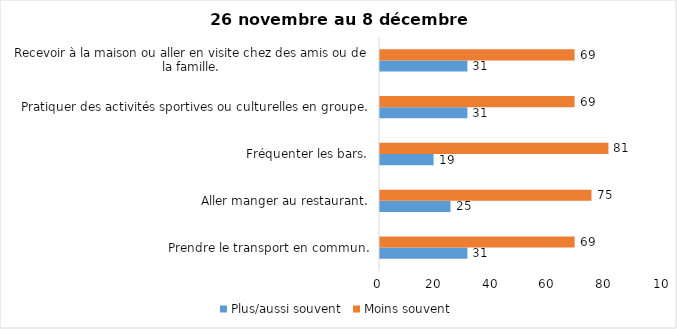
| Category | Plus/aussi souvent | Moins souvent |
|---|---|---|
| Prendre le transport en commun. | 31 | 69 |
| Aller manger au restaurant. | 25 | 75 |
| Fréquenter les bars. | 19 | 81 |
| Pratiquer des activités sportives ou culturelles en groupe. | 31 | 69 |
| Recevoir à la maison ou aller en visite chez des amis ou de la famille. | 31 | 69 |